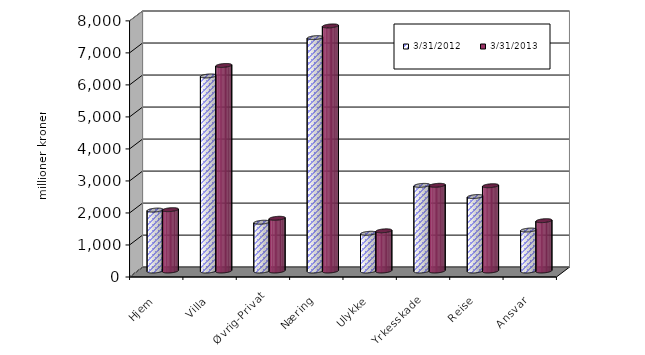
| Category | 31.03.2012 | 31.03.2013 |
|---|---|---|
| Hjem | 1902.434 | 1916.48 |
| Villa | 6092.371 | 6419.858 |
| Øvrig-Privat | 1523.38 | 1646.583 |
| Næring | 7288.787 | 7654.76 |
| Ulykke | 1178.496 | 1255.204 |
| Yrkesskade | 2674.662 | 2676.984 |
| Reise | 2325.746 | 2663.874 |
| Ansvar | 1279.126 | 1572.13 |